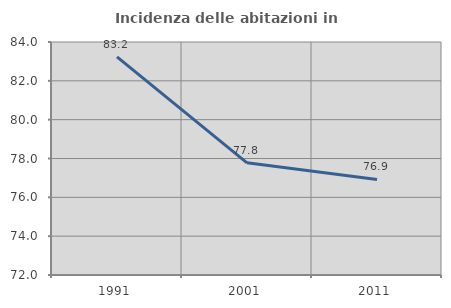
| Category | Incidenza delle abitazioni in proprietà  |
|---|---|
| 1991.0 | 83.237 |
| 2001.0 | 77.778 |
| 2011.0 | 76.923 |